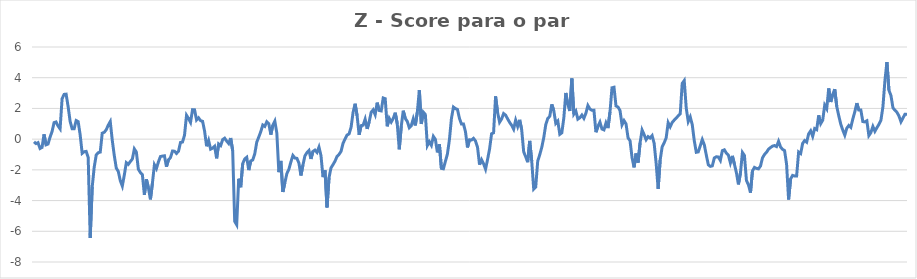
| Category | Series 0 |
|---|---|
| 0 | -0.173 |
| 1 | -0.291 |
| 2 | -0.227 |
| 3 | -0.61 |
| 4 | -0.544 |
| 5 | 0.312 |
| 6 | -0.369 |
| 7 | -0.316 |
| 8 | 0.132 |
| 9 | 0.496 |
| 10 | 1.077 |
| 11 | 1.118 |
| 12 | 0.857 |
| 13 | 0.67 |
| 14 | 2.636 |
| 15 | 2.915 |
| 16 | 2.929 |
| 17 | 2.121 |
| 18 | 1.157 |
| 19 | 0.679 |
| 20 | 0.68 |
| 21 | 1.213 |
| 22 | 1.142 |
| 23 | 0.283 |
| 24 | -0.923 |
| 25 | -0.817 |
| 26 | -0.798 |
| 27 | -1.187 |
| 28 | -6.439 |
| 29 | -3.117 |
| 30 | -1.823 |
| 31 | -1.03 |
| 32 | -0.884 |
| 33 | -0.843 |
| 34 | 0.389 |
| 35 | 0.446 |
| 36 | 0.616 |
| 37 | 0.912 |
| 38 | 1.144 |
| 39 | -0.074 |
| 40 | -1.069 |
| 41 | -1.887 |
| 42 | -2.105 |
| 43 | -2.704 |
| 44 | -3.055 |
| 45 | -2.334 |
| 46 | -1.531 |
| 47 | -1.642 |
| 48 | -1.46 |
| 49 | -1.294 |
| 50 | -0.636 |
| 51 | -0.837 |
| 52 | -1.958 |
| 53 | -2.173 |
| 54 | -2.309 |
| 55 | -3.633 |
| 56 | -2.613 |
| 57 | -3.168 |
| 58 | -3.922 |
| 59 | -2.872 |
| 60 | -1.669 |
| 61 | -1.917 |
| 62 | -1.483 |
| 63 | -1.133 |
| 64 | -1.105 |
| 65 | -1.084 |
| 66 | -1.794 |
| 67 | -1.346 |
| 68 | -1.203 |
| 69 | -0.777 |
| 70 | -0.782 |
| 71 | -0.93 |
| 72 | -0.789 |
| 73 | -0.215 |
| 74 | -0.188 |
| 75 | 0.256 |
| 76 | 1.556 |
| 77 | 1.347 |
| 78 | 1.092 |
| 79 | 1.92 |
| 80 | 1.91 |
| 81 | 1.247 |
| 82 | 1.387 |
| 83 | 1.206 |
| 84 | 1.162 |
| 85 | 0.525 |
| 86 | -0.461 |
| 87 | -0.085 |
| 88 | -0.652 |
| 89 | -0.582 |
| 90 | -0.464 |
| 91 | -1.249 |
| 92 | -0.312 |
| 93 | -0.421 |
| 94 | -0.033 |
| 95 | 0.063 |
| 96 | -0.125 |
| 97 | -0.283 |
| 98 | 0.071 |
| 99 | -0.756 |
| 100 | -5.349 |
| 101 | -5.576 |
| 102 | -2.578 |
| 103 | -3.134 |
| 104 | -1.59 |
| 105 | -1.291 |
| 106 | -1.181 |
| 107 | -2.016 |
| 108 | -1.423 |
| 109 | -1.357 |
| 110 | -0.959 |
| 111 | -0.192 |
| 112 | 0.137 |
| 113 | 0.487 |
| 114 | 0.921 |
| 115 | 0.833 |
| 116 | 1.133 |
| 117 | 1.007 |
| 118 | 0.294 |
| 119 | 0.907 |
| 120 | 1.177 |
| 121 | 0.395 |
| 122 | -2.152 |
| 123 | -1.421 |
| 124 | -3.441 |
| 125 | -2.836 |
| 126 | -2.241 |
| 127 | -1.96 |
| 128 | -1.488 |
| 129 | -1.062 |
| 130 | -1.228 |
| 131 | -1.25 |
| 132 | -1.558 |
| 133 | -2.368 |
| 134 | -1.687 |
| 135 | -1.086 |
| 136 | -0.878 |
| 137 | -0.739 |
| 138 | -1.289 |
| 139 | -0.798 |
| 140 | -0.713 |
| 141 | -0.864 |
| 142 | -0.519 |
| 143 | -1.07 |
| 144 | -2.473 |
| 145 | -2.024 |
| 146 | -4.447 |
| 147 | -2.512 |
| 148 | -1.867 |
| 149 | -1.659 |
| 150 | -1.43 |
| 151 | -1.123 |
| 152 | -0.995 |
| 153 | -0.792 |
| 154 | -0.268 |
| 155 | 0.014 |
| 156 | 0.266 |
| 157 | 0.341 |
| 158 | 0.777 |
| 159 | 1.746 |
| 160 | 2.305 |
| 161 | 1.521 |
| 162 | 0.284 |
| 163 | 0.879 |
| 164 | 0.91 |
| 165 | 1.301 |
| 166 | 0.667 |
| 167 | 1.12 |
| 168 | 1.75 |
| 169 | 1.909 |
| 170 | 1.595 |
| 171 | 2.375 |
| 172 | 1.867 |
| 173 | 1.837 |
| 174 | 2.681 |
| 175 | 2.635 |
| 176 | 0.834 |
| 177 | 1.356 |
| 178 | 1.113 |
| 179 | 1.344 |
| 180 | 1.722 |
| 181 | 1.005 |
| 182 | -0.66 |
| 183 | 0.841 |
| 184 | 1.852 |
| 185 | 1.347 |
| 186 | 1.156 |
| 187 | 0.746 |
| 188 | 0.882 |
| 189 | 1.336 |
| 190 | 0.892 |
| 191 | 1.757 |
| 192 | 3.186 |
| 193 | 0.987 |
| 194 | 1.758 |
| 195 | 1.606 |
| 196 | -0.419 |
| 197 | -0.17 |
| 198 | -0.402 |
| 199 | 0.182 |
| 200 | -0.013 |
| 201 | -0.862 |
| 202 | -0.34 |
| 203 | -1.902 |
| 204 | -1.932 |
| 205 | -1.442 |
| 206 | -0.967 |
| 207 | -0.029 |
| 208 | 1.346 |
| 209 | 2.089 |
| 210 | 1.988 |
| 211 | 1.936 |
| 212 | 1.35 |
| 213 | 0.984 |
| 214 | 0.989 |
| 215 | 0.483 |
| 216 | -0.541 |
| 217 | -0.041 |
| 218 | -0.057 |
| 219 | 0.053 |
| 220 | -0.123 |
| 221 | -0.522 |
| 222 | -1.661 |
| 223 | -1.338 |
| 224 | -1.598 |
| 225 | -1.953 |
| 226 | -1.328 |
| 227 | -0.644 |
| 228 | 0.348 |
| 229 | 0.415 |
| 230 | 2.785 |
| 231 | 1.739 |
| 232 | 1.103 |
| 233 | 1.313 |
| 234 | 1.666 |
| 235 | 1.563 |
| 236 | 1.32 |
| 237 | 1.09 |
| 238 | 0.902 |
| 239 | 0.65 |
| 240 | 1.236 |
| 241 | 0.828 |
| 242 | 1.255 |
| 243 | 0.618 |
| 244 | -0.821 |
| 245 | -1.145 |
| 246 | -1.5 |
| 247 | -0.114 |
| 248 | -1.414 |
| 249 | -3.252 |
| 250 | -3.113 |
| 251 | -1.423 |
| 252 | -1.017 |
| 253 | -0.539 |
| 254 | 0.095 |
| 255 | 0.942 |
| 256 | 1.349 |
| 257 | 1.487 |
| 258 | 2.265 |
| 259 | 1.854 |
| 260 | 1.027 |
| 261 | 1.177 |
| 262 | 0.313 |
| 263 | 0.412 |
| 264 | 1.376 |
| 265 | 3.009 |
| 266 | 2.252 |
| 267 | 1.832 |
| 268 | 3.948 |
| 269 | 1.637 |
| 270 | 1.83 |
| 271 | 1.301 |
| 272 | 1.39 |
| 273 | 1.567 |
| 274 | 1.355 |
| 275 | 1.691 |
| 276 | 2.19 |
| 277 | 1.966 |
| 278 | 1.878 |
| 279 | 1.886 |
| 280 | 0.451 |
| 281 | 0.834 |
| 282 | 1.11 |
| 283 | 0.659 |
| 284 | 0.604 |
| 285 | 1.052 |
| 286 | 0.72 |
| 287 | 1.758 |
| 288 | 3.344 |
| 289 | 3.379 |
| 290 | 2.159 |
| 291 | 2.092 |
| 292 | 1.865 |
| 293 | 0.933 |
| 294 | 1.206 |
| 295 | 0.994 |
| 296 | 0.086 |
| 297 | -0.106 |
| 298 | -1.204 |
| 299 | -1.837 |
| 300 | -0.937 |
| 301 | -1.527 |
| 302 | -0.244 |
| 303 | 0.594 |
| 304 | 0.299 |
| 305 | -0.037 |
| 306 | 0.164 |
| 307 | 0.075 |
| 308 | 0.228 |
| 309 | -0.267 |
| 310 | -1.568 |
| 311 | -3.236 |
| 312 | -1.361 |
| 313 | -0.504 |
| 314 | -0.243 |
| 315 | 0.086 |
| 316 | 1.073 |
| 317 | 0.803 |
| 318 | 1.084 |
| 319 | 1.238 |
| 320 | 1.368 |
| 321 | 1.52 |
| 322 | 1.644 |
| 323 | 3.631 |
| 324 | 3.814 |
| 325 | 2.021 |
| 326 | 1.148 |
| 327 | 1.444 |
| 328 | 0.942 |
| 329 | -0.097 |
| 330 | -0.858 |
| 331 | -0.83 |
| 332 | -0.427 |
| 333 | -0.027 |
| 334 | -0.369 |
| 335 | -1.036 |
| 336 | -1.669 |
| 337 | -1.775 |
| 338 | -1.739 |
| 339 | -1.225 |
| 340 | -1.149 |
| 341 | -1.16 |
| 342 | -1.386 |
| 343 | -0.749 |
| 344 | -0.695 |
| 345 | -0.912 |
| 346 | -1.043 |
| 347 | -1.546 |
| 348 | -1.09 |
| 349 | -1.626 |
| 350 | -2.186 |
| 351 | -2.947 |
| 352 | -2.216 |
| 353 | -0.869 |
| 354 | -1.064 |
| 355 | -2.694 |
| 356 | -2.974 |
| 357 | -3.482 |
| 358 | -2.069 |
| 359 | -1.839 |
| 360 | -1.904 |
| 361 | -1.934 |
| 362 | -1.75 |
| 363 | -1.22 |
| 364 | -0.994 |
| 365 | -0.857 |
| 366 | -0.652 |
| 367 | -0.548 |
| 368 | -0.453 |
| 369 | -0.417 |
| 370 | -0.482 |
| 371 | -0.14 |
| 372 | -0.51 |
| 373 | -0.667 |
| 374 | -0.745 |
| 375 | -1.63 |
| 376 | -3.929 |
| 377 | -2.593 |
| 378 | -2.36 |
| 379 | -2.401 |
| 380 | -2.404 |
| 381 | -0.841 |
| 382 | -0.938 |
| 383 | -0.28 |
| 384 | -0.093 |
| 385 | -0.196 |
| 386 | 0.346 |
| 387 | 0.543 |
| 388 | 0.183 |
| 389 | 0.691 |
| 390 | 0.62 |
| 391 | 1.55 |
| 392 | 1.008 |
| 393 | 1.235 |
| 394 | 2.214 |
| 395 | 1.982 |
| 396 | 3.304 |
| 397 | 2.418 |
| 398 | 2.916 |
| 399 | 3.254 |
| 400 | 2.124 |
| 401 | 1.52 |
| 402 | 0.977 |
| 403 | 0.592 |
| 404 | 0.258 |
| 405 | 0.713 |
| 406 | 0.889 |
| 407 | 0.766 |
| 408 | 1.309 |
| 409 | 1.782 |
| 410 | 2.345 |
| 411 | 1.894 |
| 412 | 1.894 |
| 413 | 1.143 |
| 414 | 1.123 |
| 415 | 1.196 |
| 416 | 0.232 |
| 417 | 0.425 |
| 418 | 0.825 |
| 419 | 0.511 |
| 420 | 0.745 |
| 421 | 0.96 |
| 422 | 1.227 |
| 423 | 2.097 |
| 424 | 3.809 |
| 425 | 5.022 |
| 426 | 3.183 |
| 427 | 2.844 |
| 428 | 2.044 |
| 429 | 1.88 |
| 430 | 1.746 |
| 431 | 1.508 |
| 432 | 1.128 |
| 433 | 1.381 |
| 434 | 1.623 |
| 435 | 1.61 |